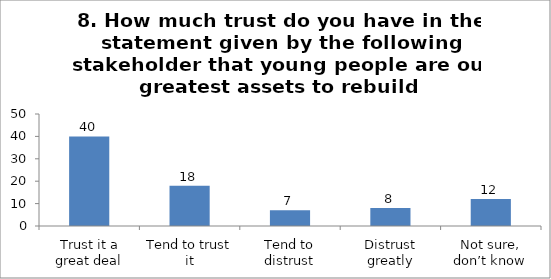
| Category | 8. How much trust do you have in the statement given by the following stakeholder that young people are our greatest assets to rebuild Pakistan?(Media) |
|---|---|
| Trust it a great deal | 40 |
| Tend to trust it | 18 |
| Tend to distrust | 7 |
| Distrust greatly | 8 |
| Not sure, don’t know | 12 |